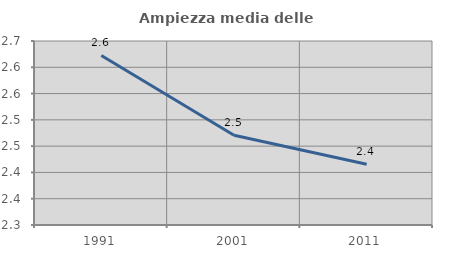
| Category | Ampiezza media delle famiglie |
|---|---|
| 1991.0 | 2.622 |
| 2001.0 | 2.471 |
| 2011.0 | 2.416 |